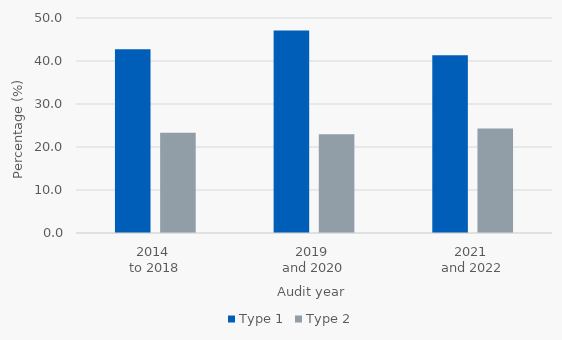
| Category | Type 1 | Type 2 |
|---|---|---|
| 2014 
to 2018 | 42.711 | 23.342 |
| 2019 
and 2020 | 47.074 | 22.956 |
| 2021 
and 2022 | 41.353 | 24.327 |